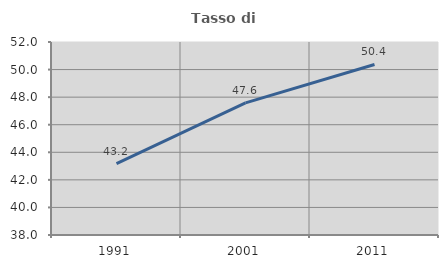
| Category | Tasso di occupazione   |
|---|---|
| 1991.0 | 43.176 |
| 2001.0 | 47.586 |
| 2011.0 | 50.371 |